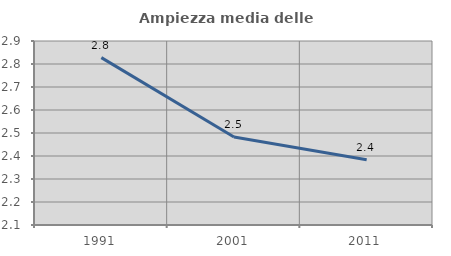
| Category | Ampiezza media delle famiglie |
|---|---|
| 1991.0 | 2.828 |
| 2001.0 | 2.482 |
| 2011.0 | 2.384 |